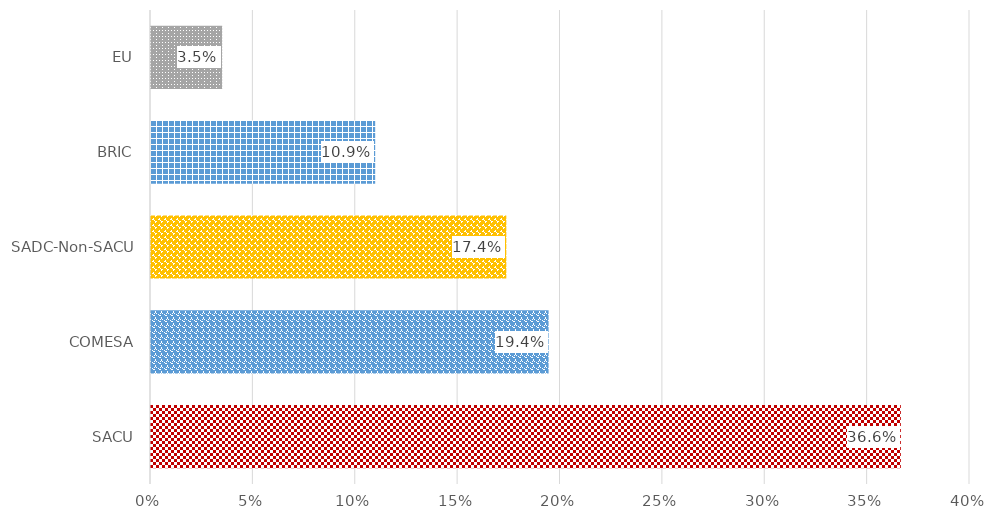
| Category | %Share |
|---|---|
| SACU | 0.366 |
| COMESA | 0.194 |
| SADC-Non-SACU | 0.174 |
| BRIC | 0.109 |
| EU | 0.035 |